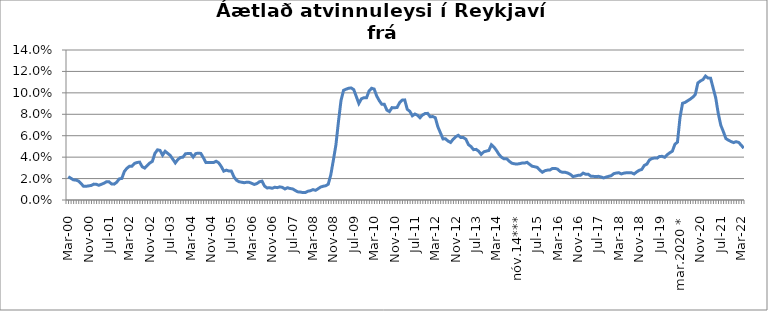
| Category | Series 0 |
|---|---|
| mar.00 | 0.022 |
| apr.00 | 0.02 |
| maí.00 | 0.019 |
| jún.00 | 0.019 |
| júl.00 | 0.018 |
| ágú.00 | 0.015 |
| sep.00 | 0.013 |
| okt.00 | 0.013 |
| nóv.00 | 0.013 |
| des.00 | 0.014 |
| jan.01 | 0.015 |
| feb.01 | 0.015 |
| mar.01 | 0.014 |
| apr.01 | 0.015 |
| maí.01 | 0.016 |
| jún.01 | 0.017 |
| júl.01 | 0.017 |
| ágú.01 | 0.015 |
| sep.01 | 0.015 |
| okt.01 | 0.017 |
| nóv.01 | 0.02 |
| des.01 | 0.02 |
| jan.02 | 0.027 |
| feb.02 | 0.03 |
| mar.02 | 0.031 |
| apr.02 | 0.032 |
| maí.02 | 0.034 |
| jún.02 | 0.035 |
| júl.02 | 0.035 |
| ágú.02 | 0.031 |
| sep.02 | 0.03 |
| okt.02 | 0.032 |
| nóv.02 | 0.035 |
| des.02 | 0.036 |
| jan.03 | 0.044 |
| feb.03 | 0.047 |
| mar.03 | 0.046 |
| apr.03 | 0.042 |
| maí.03 | 0.045 |
| jún.03 | 0.044 |
| júl.03 | 0.042 |
| ágú.03 | 0.038 |
| sep.03 | 0.035 |
| okt.03 | 0.038 |
| nóv.03 | 0.04 |
| des.03 | 0.04 |
| jan.04 | 0.043 |
| feb.04 | 0.043 |
| mar.04 | 0.043 |
| apr.04 | 0.04 |
| maí.04 | 0.043 |
| jún.04 | 0.044 |
| júl.04 | 0.043 |
| ágú.04 | 0.039 |
| sep.04 | 0.035 |
| okt.04 | 0.035 |
| nóv.04 | 0.035 |
| des.04 | 0.035 |
| jan.05 | 0.036 |
| feb.05 | 0.035 |
| mar.05 | 0.031 |
| apr.05 | 0.027 |
| maí.05 | 0.028 |
| jún.05 | 0.027 |
| júl.05 | 0.027 |
| ágú.05 | 0.022 |
| sep.05 | 0.018 |
| okt.05 | 0.017 |
| nóv.05 | 0.017 |
| des.05 | 0.016 |
| jan.06 | 0.017 |
| feb.06 | 0.016 |
| mar.06 | 0.016 |
| apr.06 | 0.014 |
| maí.06 | 0.015 |
| jún.06 | 0.017 |
| júl.06 | 0.018 |
| ágú.06 | 0.013 |
| sep.06 | 0.011 |
| okt.06 | 0.011 |
| nóv.06 | 0.011 |
| des.06 | 0.012 |
| jan.07 | 0.012 |
| feb.07 | 0.012 |
| mar.07 | 0.012 |
| apr.07 | 0.01 |
| maí.07 | 0.011 |
| jún.07 | 0.011 |
| júl.07 | 0.01 |
| ágú.07 | 0.009 |
| sep.07 | 0.008 |
| okt.07 | 0.007 |
| nóv.07 | 0.007 |
| des.07 | 0.007 |
| jan.08 | 0.008 |
| feb.08 | 0.009 |
| mar.08 | 0.01 |
| apr.08 | 0.009 |
| maí.08 | 0.01 |
| jún.08 | 0.012 |
| júl.08 | 0.013 |
| ágú.08 | 0.013 |
| sep.08 | 0.015 |
| okt.08 | 0.024 |
| nóv.08 | 0.037 |
| des.08 | 0.051 |
| jan.09 | 0.073 |
| feb.09 | 0.093 |
| mar.09 | 0.102 |
| apr.09 | 0.103 |
| maí.09 | 0.104 |
| jún.09 | 0.105 |
| júl.09 | 0.103 |
| ágú.09 | 0.097 |
| sep.09 | 0.09 |
| okt.09 | 0.094 |
| nóv.09 | 0.095 |
| des.09 | 0.095 |
| jan.10 | 0.102 |
| feb.10 | 0.104 |
| mar.10 | 0.104 |
| apr.10 | 0.097 |
| maí.10 | 0.093 |
| jún.10 | 0.089 |
| júl.10 | 0.089 |
| ágú.10 | 0.084 |
| sep.10 | 0.083 |
| okt.10 | 0.086 |
| nóv.10 | 0.086 |
| des.10 | 0.086 |
| jan.11 | 0.091 |
| feb.11 | 0.093 |
| mar.11 | 0.093 |
| apr.11 | 0.085 |
| maí.11 | 0.083 |
| jún.11 | 0.079 |
| júl.11 | 0.08 |
| ágú.11 | 0.079 |
| sep.11 | 0.077 |
| okt.11 | 0.079 |
| nóv.11 | 0.081 |
| des.11 | 0.081 |
| jan.12 | 0.078 |
| feb.12 | 0.078 |
| mar.12 | 0.077 |
| apr.12 | 0.068 |
| maí.12 | 0.063 |
| jún.12 | 0.057 |
| júl.12 | 0.057 |
| ágú.12 | 0.055 |
| sep.12 | 0.054 |
| okt.12 | 0.057 |
| nóv.12 | 0.059 |
| des.12 | 0.06 |
| jan.13 | 0.058 |
| feb.13 | 0.058 |
| mar.13 | 0.057 |
| apr.13 | 0.052 |
| maí.13 | 0.05 |
| jún.13 | 0.047 |
| júl.13 | 0.047 |
| ágú.13 | 0.046 |
| sep.13 | 0.043 |
| okt.13 | 0.045 |
| nóv.13 | 0.046 |
| des.13 | 0.046 |
| jan.14 | 0.052 |
| feb.14 | 0.049 |
| mar.14 | 0.046 |
| apr.14 | 0.042 |
| maí.14 | 0.04 |
| jún.14 | 0.038 |
| júl.14 | 0.038 |
| ágú.14 | 0.036 |
| sep.14 | 0.034 |
| okt.14*** | 0.034 |
| nóv.14*** | 0.034 |
| des.14 | 0.034 |
| jan.15 | 0.034 |
| feb.15 | 0.034 |
| mar.15 | 0.035 |
| apr.15 | 0.033 |
| maí.15 | 0.032 |
| jún.15 | 0.031 |
| júl.15 | 0.03 |
| ágú.15 | 0.028 |
| sep.15 | 0.026 |
| okt.15 | 0.027 |
| nóv.15 | 0.028 |
| des.15 | 0.028 |
| jan.16 | 0.03 |
| feb.16 | 0.029 |
| mar.16 | 0.029 |
| apr.16 | 0.027 |
| maí.16 | 0.026 |
| jún.16 | 0.026 |
| júl.16 | 0.025 |
| ágú.16 | 0.024 |
| sep.16 | 0.022 |
| okt.16 | 0.022 |
| nóv.16 | 0.023 |
| des.16 | 0.023 |
| jan.17 | 0.025 |
| feb.17 | 0.024 |
| mar.17 | 0.024 |
| apr.17 | 0.022 |
| maí.17 | 0.022 |
| jún.17 | 0.022 |
| júl.17 | 0.022 |
| ágú.17 | 0.022 |
| sep.17 | 0.021 |
| okt.17 | 0.021 |
| nóv.17 | 0.022 |
| des.17 | 0.023 |
| jan.18 | 0.025 |
| feb.18 | 0.025 |
| mar.18 | 0.025 |
| apr.18 | 0.024 |
| maí.18 | 0.025 |
| jún.18 | 0.025 |
| júl.18 | 0.025 |
| ágú.18 | 0.025 |
| sep.18 | 0.024 |
| okt.18 | 0.026 |
| nóv.18 | 0.028 |
| des.18 | 0.029 |
| jan.19 | 0.032 |
| feb.19 | 0.033 |
| mar.19 | 0.037 |
| apr.19 | 0.039 |
| maí.19 | 0.039 |
| jún.19 | 0.039 |
| júl.19 | 0.041 |
| ágú.19 | 0.041 |
| sep.19 | 0.04 |
| okt.19 | 0.042 |
| nóv.19 | 0.044 |
| des.19 | 0.046 |
| jan.20 | 0.052 |
| feb.20 | 0.054 |
| mar.2020 * | 0.077 |
| apr.20 | 0.09 |
| maí.20 | 0.091 |
| jún.20 | 0.093 |
| júl.20 | 0.094 |
| ágú.20 | 0.096 |
| sep.20 | 0.098 |
| okt.20 | 0.109 |
| nóv.20 | 0.111 |
| des.20 | 0.112 |
| jan.21 | 0.116 |
| feb.21 | 0.114 |
| mar.21 | 0.114 |
| apr.21 | 0.104 |
| maí.21 | 0.095 |
| jún.21 | 0.081 |
| júl.21 | 0.07 |
| ágú.21 | 0.064 |
| sep.21 | 0.057 |
| okt.21 | 0.056 |
| nóv.21 | 0.055 |
| des.21 | 0.054 |
| jan.22 | 0.054 |
| feb.22 | 0.054 |
| mar.22 | 0.051 |
| apr.22 | 0.048 |